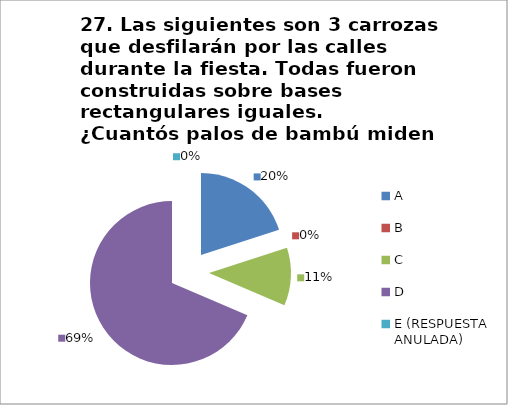
| Category | CANTIDAD DE RESPUESTAS PREGUNTA (27) | PORCENTAJE |
|---|---|---|
| A | 7 | 0.2 |
| B | 0 | 0 |
| C | 4 | 0.114 |
| D | 24 | 0.686 |
| E (RESPUESTA ANULADA) | 0 | 0 |